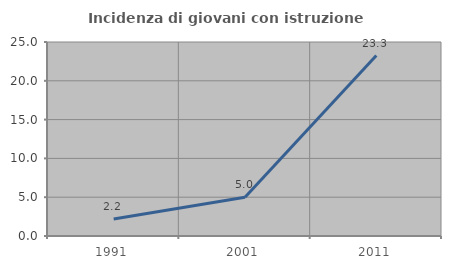
| Category | Incidenza di giovani con istruzione universitaria |
|---|---|
| 1991.0 | 2.198 |
| 2001.0 | 5 |
| 2011.0 | 23.256 |